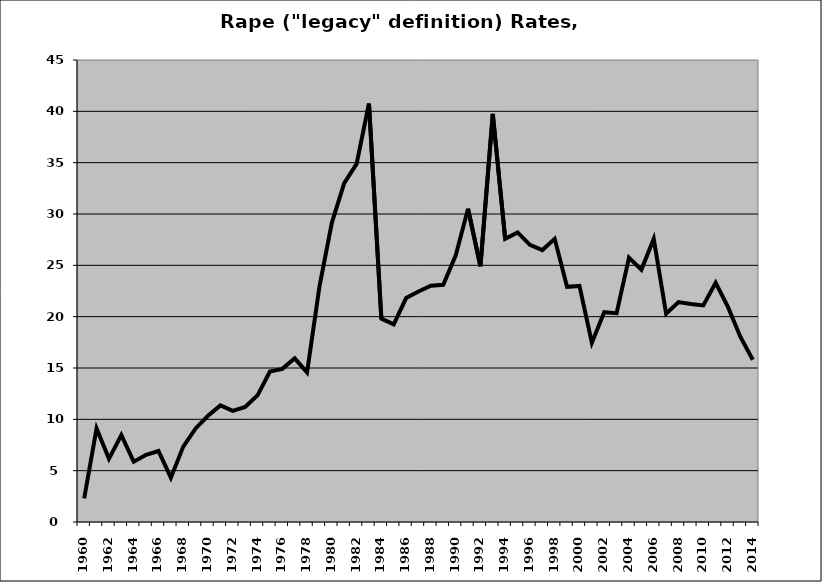
| Category | Rape |
|---|---|
| 1960.0 | 2.308 |
| 1961.0 | 9.114 |
| 1962.0 | 6.154 |
| 1963.0 | 8.462 |
| 1964.0 | 5.868 |
| 1965.0 | 6.549 |
| 1966.0 | 6.914 |
| 1967.0 | 4.317 |
| 1968.0 | 7.346 |
| 1969.0 | 9.112 |
| 1970.0 | 10.343 |
| 1971.0 | 11.354 |
| 1972.0 | 10.823 |
| 1973.0 | 11.207 |
| 1974.0 | 12.34 |
| 1975.0 | 14.65 |
| 1976.0 | 14.916 |
| 1977.0 | 15.942 |
| 1978.0 | 14.579 |
| 1979.0 | 22.921 |
| 1980.0 | 29.141 |
| 1981.0 | 33.01 |
| 1982.0 | 34.884 |
| 1983.0 | 40.762 |
| 1984.0 | 19.811 |
| 1985.0 | 19.252 |
| 1986.0 | 21.811 |
| 1987.0 | 22.445 |
| 1988.0 | 23.022 |
| 1989.0 | 23.104 |
| 1990.0 | 25.944 |
| 1991.0 | 30.511 |
| 1992.0 | 24.912 |
| 1993.0 | 39.757 |
| 1994.0 | 27.586 |
| 1995.0 | 28.205 |
| 1996.0 | 26.995 |
| 1997.0 | 26.486 |
| 1998.0 | 27.58 |
| 1999.0 | 22.906 |
| 2000.0 | 22.995 |
| 2001.0 | 17.456 |
| 2002.0 | 20.441 |
| 2003.0 | 20.344 |
| 2004.0 | 25.755 |
| 2005.0 | 24.583 |
| 2006.0 | 27.568 |
| 2007.0 | 20.282 |
| 2008.0 | 21.415 |
| 2009.0 | 21.23 |
| 2010.0 | 21.095 |
| 2011.0 | 23.301 |
| 2012.0 | 20.928 |
| 2013.0 | 18.026 |
| 2014.0 | 15.801 |